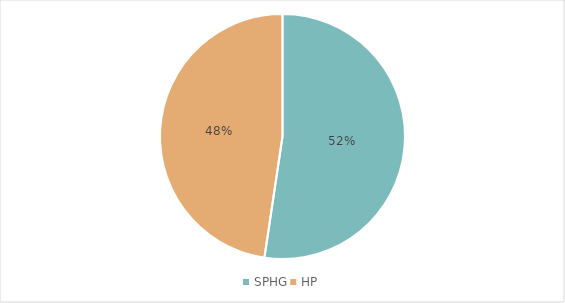
| Category | Nombre total de séjours |
|---|---|
| SPHG | 58769 |
| HP | 53474 |